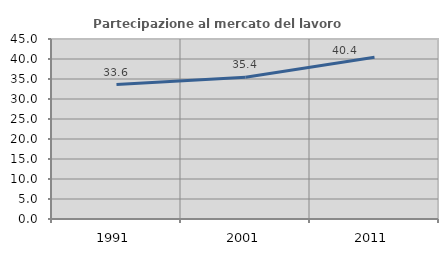
| Category | Partecipazione al mercato del lavoro  femminile |
|---|---|
| 1991.0 | 33.623 |
| 2001.0 | 35.437 |
| 2011.0 | 40.415 |